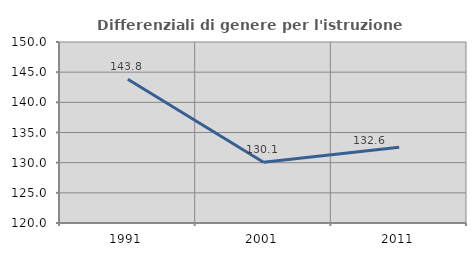
| Category | Differenziali di genere per l'istruzione superiore |
|---|---|
| 1991.0 | 143.84 |
| 2001.0 | 130.075 |
| 2011.0 | 132.567 |